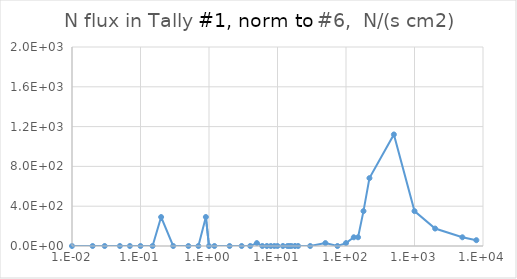
| Category | Series 0 |
|---|---|
| 0.01 | 0 |
| 0.015 | 0 |
| 0.02 | 0 |
| 0.03 | 0 |
| 0.04 | 0 |
| 0.05 | 0 |
| 0.06 | 0 |
| 0.07 | 0 |
| 0.08 | 0 |
| 0.1 | 0 |
| 0.15 | 0 |
| 0.2 | 0 |
| 0.3 | 0 |
| 0.4 | 0 |
| 0.5 | 0 |
| 0.511 | 0 |
| 0.6 | 0 |
| 0.662 | 0 |
| 0.8 | 0 |
| 1.0 | 0 |
| 1.117 | 0 |
| 1.33 | 0 |
| 1.5 | 0 |
| 2.0 | 0 |
| 3.0 | 235.534 |
| 4.0 | 117.767 |
| 5.0 | 0 |
| 6.0 | 117.767 |
| 6.129 | 0 |
| 8.0 | 117.767 |
| 10.0 | 0 |
| 15.0 | 0 |
| 20.0 | 0 |
| 30.0 | 0 |
| 40.0 | 0 |
| 50.0 | 0 |
| 60.0 | 0 |
| 80.0 | 0 |
| 100.0 | 0 |
| 150.0 | 0 |
| 200.0 | 0 |
| 300.0 | 0 |
| 400.0 | 0 |
| 500.0 | 0 |
| 600.0 | 0 |
| 800.0 | 0 |
| 1000.0 | 0 |
| 1500.0 | 0 |
| 2000.0 | 0 |
| 3000.0 | 0 |
| 4000.0 | 0 |
| 5000.0 | 0 |
| 6000.0 | 0 |
| 8000.0 | 0 |
| 10000.0 | 0 |